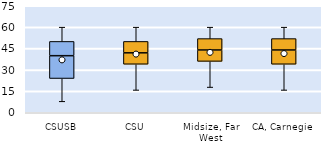
| Category | 25th | 50th | 75th |
|---|---|---|---|
| CSUSB | 24 | 16 | 10 |
| CSU | 34 | 8 | 8 |
| Midsize, Far West | 36 | 8 | 8 |
| CA, Carnegie | 34 | 10 | 8 |